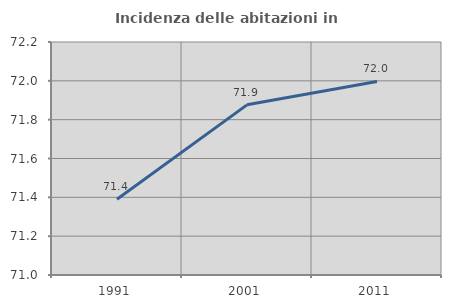
| Category | Incidenza delle abitazioni in proprietà  |
|---|---|
| 1991.0 | 71.39 |
| 2001.0 | 71.876 |
| 2011.0 | 71.997 |